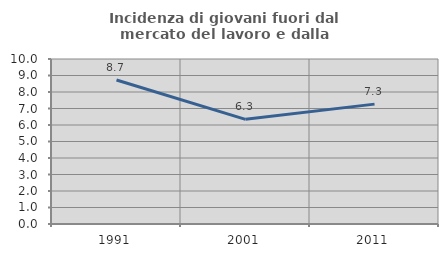
| Category | Incidenza di giovani fuori dal mercato del lavoro e dalla formazione  |
|---|---|
| 1991.0 | 8.73 |
| 2001.0 | 6.343 |
| 2011.0 | 7.265 |